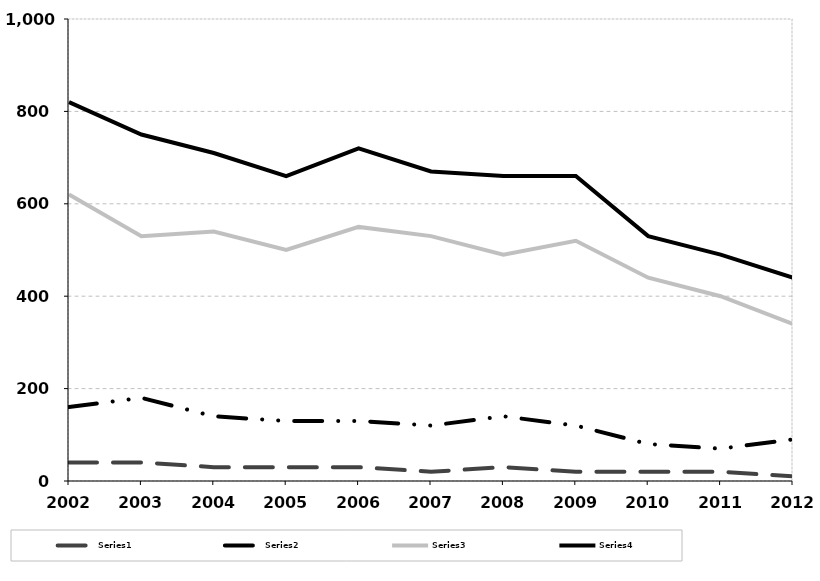
| Category | Series 0 | Series 1 | Series 2 | Series 3 |
|---|---|---|---|---|
| 2002.0 | 40 | 160 | 620 | 820 |
| 2003.0 | 40 | 180 | 530 | 750 |
| 2004.0 | 30 | 140 | 540 | 710 |
| 2005.0 | 30 | 130 | 500 | 660 |
| 2006.0 | 30 | 130 | 550 | 720 |
| 2007.0 | 20 | 120 | 530 | 670 |
| 2008.0 | 30 | 140 | 490 | 660 |
| 2009.0 | 20 | 120 | 520 | 660 |
| 2010.0 | 20 | 80 | 440 | 530 |
| 2011.0 | 20 | 70 | 400 | 490 |
| 2012.0 | 10 | 90 | 340 | 440 |